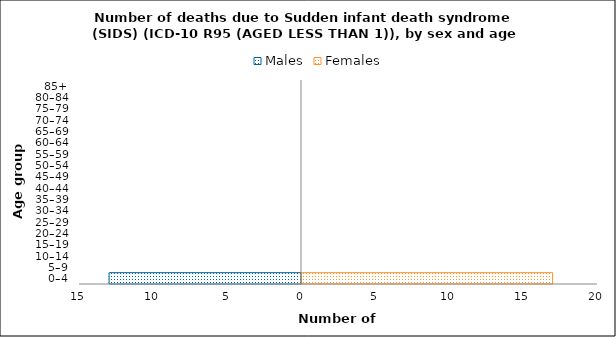
| Category | Males | Females |
|---|---|---|
| 0–4 | -13 | 17 |
| 5–9 | 0 | 0 |
| 10–14 | 0 | 0 |
| 15–19 | 0 | 0 |
| 20–24 | 0 | 0 |
| 25–29 | 0 | 0 |
| 30–34 | 0 | 0 |
| 35–39 | 0 | 0 |
| 40–44 | 0 | 0 |
| 45–49 | 0 | 0 |
| 50–54 | 0 | 0 |
| 55–59 | 0 | 0 |
| 60–64 | 0 | 0 |
| 65–69 | 0 | 0 |
| 70–74 | 0 | 0 |
| 75–79 | 0 | 0 |
| 80–84 | 0 | 0 |
| 85+ | 0 | 0 |